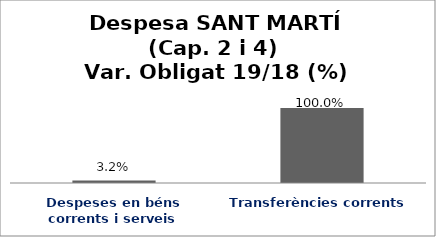
| Category | Series 0 |
|---|---|
| Despeses en béns corrents i serveis | 0.032 |
| Transferències corrents | 1 |